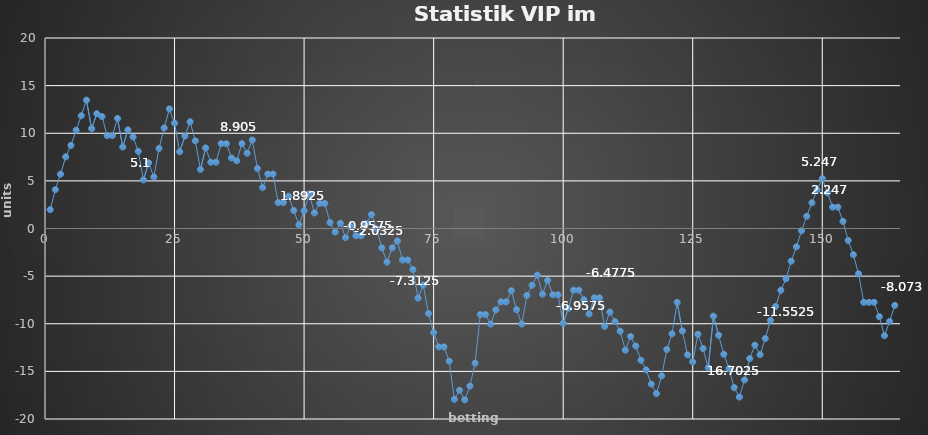
| Category | Series 0 |
|---|---|
| 0 | 1.98 |
| 1 | 4.08 |
| 2 | 5.7 |
| 3 | 7.52 |
| 4 | 8.72 |
| 5 | 10.32 |
| 6 | 11.84 |
| 7 | 13.475 |
| 8 | 10.475 |
| 9 | 12.05 |
| 10 | 11.75 |
| 11 | 9.75 |
| 12 | 9.75 |
| 13 | 11.55 |
| 14 | 8.55 |
| 15 | 10.35 |
| 16 | 9.6 |
| 17 | 8.1 |
| 18 | 5.1 |
| 19 | 6.9 |
| 20 | 5.4 |
| 21 | 8.4 |
| 22 | 10.56 |
| 23 | 12.555 |
| 24 | 11.055 |
| 25 | 8.055 |
| 26 | 9.705 |
| 27 | 11.205 |
| 28 | 9.205 |
| 29 | 6.205 |
| 30 | 8.455 |
| 31 | 6.955 |
| 32 | 6.955 |
| 33 | 8.905 |
| 34 | 8.905 |
| 35 | 7.405 |
| 36 | 7.105 |
| 37 | 8.905 |
| 38 | 7.905 |
| 39 | 9.292 |
| 40 | 6.292 |
| 41 | 4.292 |
| 42 | 5.718 |
| 43 | 5.718 |
| 44 | 2.718 |
| 45 | 2.718 |
| 46 | 3.392 |
| 47 | 1.892 |
| 48 | 0.393 |
| 49 | 1.862 |
| 50 | 3.633 |
| 51 | 1.633 |
| 52 | 2.623 |
| 53 | 2.623 |
| 54 | 0.623 |
| 55 | -0.377 |
| 56 | 0.543 |
| 57 | -0.957 |
| 58 | 0.242 |
| 59 | -0.758 |
| 60 | -0.758 |
| 61 | 0.518 |
| 62 | 1.468 |
| 63 | -0.032 |
| 64 | -2.032 |
| 65 | -3.532 |
| 66 | -2.032 |
| 67 | -1.312 |
| 68 | -3.312 |
| 69 | -3.312 |
| 70 | -4.312 |
| 71 | -7.312 |
| 72 | -5.932 |
| 73 | -8.933 |
| 74 | -10.933 |
| 75 | -12.433 |
| 76 | -12.433 |
| 77 | -13.933 |
| 78 | -17.932 |
| 79 | -16.982 |
| 80 | -17.982 |
| 81 | -16.542 |
| 82 | -14.142 |
| 83 | -9.032 |
| 84 | -9.032 |
| 85 | -10.032 |
| 86 | -8.548 |
| 87 | -7.698 |
| 88 | -7.698 |
| 89 | -6.528 |
| 90 | -8.528 |
| 91 | -10.028 |
| 92 | -7.028 |
| 93 | -5.958 |
| 94 | -4.898 |
| 95 | -6.898 |
| 96 | -5.458 |
| 97 | -6.958 |
| 98 | -6.958 |
| 99 | -9.958 |
| 100 | -8.398 |
| 101 | -6.478 |
| 102 | -6.478 |
| 103 | -7.478 |
| 104 | -8.978 |
| 105 | -7.278 |
| 106 | -7.278 |
| 107 | -10.278 |
| 108 | -8.778 |
| 109 | -9.778 |
| 110 | -10.778 |
| 111 | -12.778 |
| 112 | -11.338 |
| 113 | -12.338 |
| 114 | -13.838 |
| 115 | -14.838 |
| 116 | -16.337 |
| 117 | -17.338 |
| 118 | -15.478 |
| 119 | -12.702 |
| 120 | -11.062 |
| 121 | -7.762 |
| 122 | -10.762 |
| 123 | -13.262 |
| 124 | -14.012 |
| 125 | -11.102 |
| 126 | -12.602 |
| 127 | -14.602 |
| 128 | -9.202 |
| 129 | -11.202 |
| 130 | -13.202 |
| 131 | -14.702 |
| 132 | -16.702 |
| 133 | -17.702 |
| 134 | -15.902 |
| 135 | -13.652 |
| 136 | -12.252 |
| 137 | -13.252 |
| 138 | -11.552 |
| 139 | -9.652 |
| 140 | -8.182 |
| 141 | -6.482 |
| 142 | -5.282 |
| 143 | -3.432 |
| 144 | -1.932 |
| 145 | -0.232 |
| 146 | 1.283 |
| 147 | 2.697 |
| 148 | 4.047 |
| 149 | 5.247 |
| 150 | 3.747 |
| 151 | 2.247 |
| 152 | 2.247 |
| 153 | 0.747 |
| 154 | -1.253 |
| 155 | -2.753 |
| 156 | -4.753 |
| 157 | -7.753 |
| 158 | -7.753 |
| 159 | -7.753 |
| 160 | -9.253 |
| 161 | -11.253 |
| 162 | -9.753 |
| 163 | -8.073 |